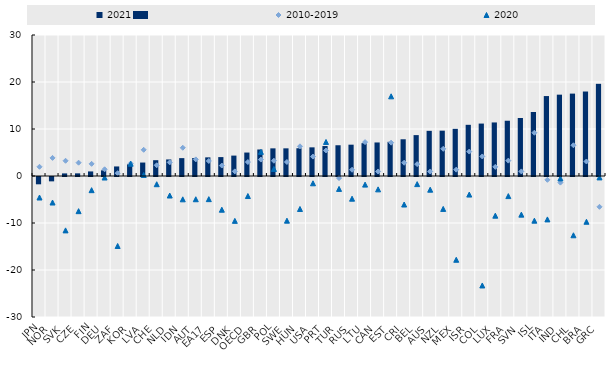
| Category | 2021 |
|---|---|
| JPN | -1.555 |
| NOR | -0.926 |
| SVK | 0.553 |
| CZE | 0.563 |
| FIN | 0.973 |
| DEU | 1.207 |
| ZAF | 2.033 |
| KOR | 2.48 |
| LVA | 2.863 |
| CHE | 3.363 |
| NLD | 3.522 |
| IDN | 3.803 |
| AUT | 3.834 |
| EA17 | 3.966 |
| ESP | 4.023 |
| DNK | 4.341 |
| OECD | 4.991 |
| GBR | 5.64 |
| POL | 5.883 |
| SWE | 5.885 |
| HUN | 5.906 |
| USA | 6.096 |
| PRT | 6.375 |
| TUR | 6.543 |
| RUS | 6.664 |
| LTU | 6.986 |
| CAN | 7.136 |
| EST | 7.273 |
| CRI | 7.816 |
| BEL | 8.7 |
| AUS | 9.609 |
| NZL | 9.647 |
| MEX | 10.034 |
| ISR | 10.891 |
| COL | 11.156 |
| LUX | 11.394 |
| FRA | 11.757 |
| SVN | 12.342 |
| ISL | 13.619 |
| ITA | 17.009 |
| IND | 17.306 |
| CHL | 17.531 |
| BRA | 17.975 |
| GRC | 19.611 |